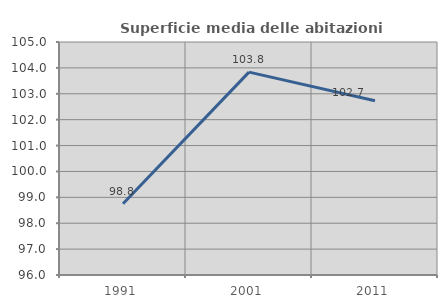
| Category | Superficie media delle abitazioni occupate |
|---|---|
| 1991.0 | 98.751 |
| 2001.0 | 103.836 |
| 2011.0 | 102.734 |